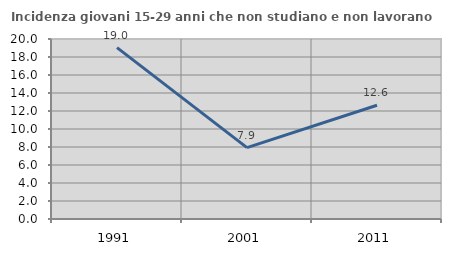
| Category | Incidenza giovani 15-29 anni che non studiano e non lavorano  |
|---|---|
| 1991.0 | 19.048 |
| 2001.0 | 7.928 |
| 2011.0 | 12.636 |